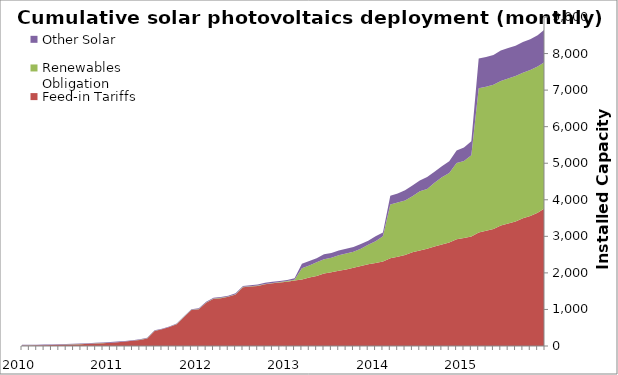
| Category | Feed-in Tariffs | Renewables Obligation | Other Solar |
|---|---|---|---|
| 2010.0 | 14.621 | 2.112 | 14.6 |
| nan | 16.002 | 2.121 | 14.6 |
| nan | 18.522 | 2.144 | 14.6 |
| nan | 21.162 | 2.166 | 14.6 |
| nan | 25.464 | 2.178 | 14.6 |
| nan | 31.036 | 2.203 | 14.6 |
| nan | 36.936 | 2.222 | 14.6 |
| nan | 42.729 | 2.23 | 14.6 |
| nan | 50.258 | 2.236 | 14.6 |
| nan | 59.712 | 2.253 | 14.6 |
| nan | 70.293 | 2.264 | 14.6 |
| nan | 78.321 | 2.277 | 14.6 |
| 2011.0 | 89.5 | 2.277 | 14.6 |
| nan | 102.881 | 2.277 | 14.6 |
| nan | 122.684 | 2.294 | 14.6 |
| nan | 141.938 | 2.302 | 14.6 |
| nan | 165.591 | 2.345 | 14.6 |
| nan | 206.679 | 2.378 | 14.6 |
| nan | 411.624 | 2.395 | 14.6 |
| nan | 456.374 | 2.425 | 14.6 |
| nan | 518.856 | 2.478 | 14.6 |
| nan | 597.972 | 2.572 | 14.6 |
| nan | 795.203 | 2.668 | 14.6 |
| nan | 982.82 | 7.314 | 14.6 |
| 2012.0 | 1007.246 | 7.449 | 20.6 |
| nan | 1180.906 | 7.508 | 20.6 |
| nan | 1291.687 | 8.487 | 20.6 |
| nan | 1309.11 | 8.577 | 20.6 |
| nan | 1345.126 | 8.658 | 20.6 |
| nan | 1410.059 | 8.761 | 26.1 |
| nan | 1609.432 | 8.852 | 26.1 |
| nan | 1624.373 | 9.275 | 31.5 |
| nan | 1643.235 | 9.698 | 31.5 |
| nan | 1687.434 | 10.457 | 31.5 |
| nan | 1713.616 | 11.321 | 31.5 |
| nan | 1735.698 | 11.902 | 31.5 |
| 2013.0 | 1760.422 | 15.194 | 31.5 |
| nan | 1788.644 | 26.951 | 38.22 |
| nan | 1822.375 | 301.39 | 123.617 |
| nan | 1876.561 | 328.414 | 116.886 |
| nan | 1913.442 | 380.639 | 103.456 |
| nan | 1980.939 | 393.75 | 134.956 |
| nan | 2014.463 | 401.217 | 129.568 |
| nan | 2056.64 | 425.262 | 129.739 |
| nan | 2095.461 | 435.227 | 129.739 |
| nan | 2140.432 | 437.844 | 129.739 |
| nan | 2185.492 | 475.128 | 130.169 |
| nan | 2233.14 | 539.884 | 107.739 |
| 2014.0 | 2267.874 | 597.752 | 137.327 |
| nan | 2311.22 | 693.138 | 99.013 |
| nan | 2401.81 | 1471.202 | 236.758 |
| nan | 2443.85 | 1485.026 | 239.513 |
| nan | 2492.604 | 1487.735 | 277.113 |
| nan | 2562.474 | 1535.023 | 290.109 |
| nan | 2613.283 | 1619.981 | 297.412 |
| nan | 2661.544 | 1631.3 | 333.47 |
| nan | 2719.019 | 1745.239 | 299.307 |
| nan | 2777.573 | 1837.391 | 303.698 |
| nan | 2832.922 | 1898.385 | 321.555 |
| nan | 2920.889 | 2082.943 | 344.255 |
| 2015.0 | 2952.018 | 2111.868 | 368.391 |
| nan | 2994.999 | 2219.947 | 387.483 |
| nan | 3108.099 | 3940.227 | 814.486 |
| nan | 3150.361 | 3943.741 | 814.766 |
| nan | 3197.372 | 3950.56 | 814.967 |
| nan | 3298.139 | 3952.821 | 830.52 |